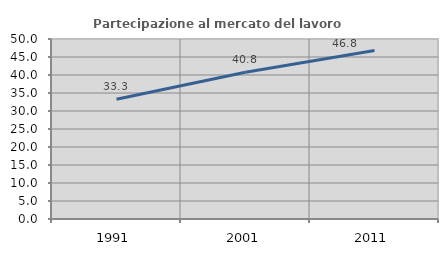
| Category | Partecipazione al mercato del lavoro  femminile |
|---|---|
| 1991.0 | 33.285 |
| 2001.0 | 40.77 |
| 2011.0 | 46.811 |